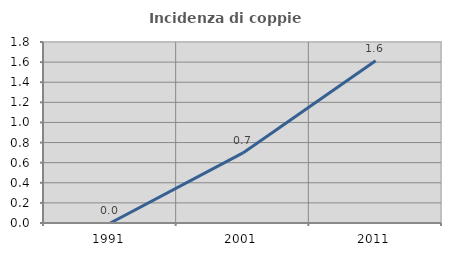
| Category | Incidenza di coppie miste |
|---|---|
| 1991.0 | 0 |
| 2001.0 | 0.697 |
| 2011.0 | 1.613 |